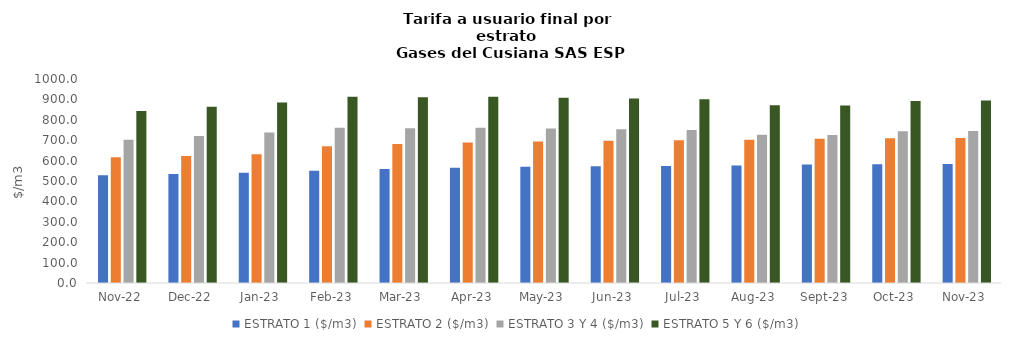
| Category | ESTRATO 1 ($/m3) | ESTRATO 2 ($/m3) | ESTRATO 3 Y 4 ($/m3) | ESTRATO 5 Y 6 ($/m3) |
|---|---|---|---|---|
| 2022-11-01 | 527.9 | 615.9 | 702.35 | 842.82 |
| 2022-12-01 | 533.8 | 622.78 | 720.1 | 864.12 |
| 2023-01-01 | 540.64 | 630.76 | 737.34 | 884.808 |
| 2023-02-01 | 550.34 | 670.8 | 760.69 | 912.828 |
| 2023-03-01 | 559.36 | 681.79 | 758.71 | 910.452 |
| 2023-04-01 | 565.3 | 689.03 | 760.69 | 912.828 |
| 2023-05-01 | 569.53 | 694.19 | 757.13 | 908.556 |
| 2023-06-01 | 571.88 | 697.06 | 753.75 | 904.5 |
| 2023-07-01 | 573.63 | 699.2 | 750.21 | 900.252 |
| 2023-08-01 | 576.45 | 702.64 | 726.44 | 871.728 |
| 2023-09-01 | 580.51 | 707.59 | 725.31 | 870.372 |
| 2023-10-01 | 581.75 | 709.1 | 743.81 | 892.572 |
| 2023-11-01 | 583.2 | 710.87 | 745.28 | 894.336 |